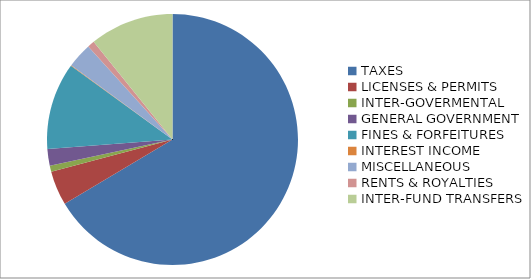
| Category | Series 0 |
|---|---|
| TAXES | 11018150 |
| LICENSES & PERMITS | 736050 |
| INTER-GOVERMENTAL | 128000 |
| GENERAL GOVERNMENT | 356700 |
| FINES & FORFEITURES | 1855000 |
| INTEREST INCOME | 12355 |
| MISCELLANEOUS  | 535684 |
| RENTS & ROYALTIES | 149000 |
| INTER-FUND TRANSFERS | 1793008 |